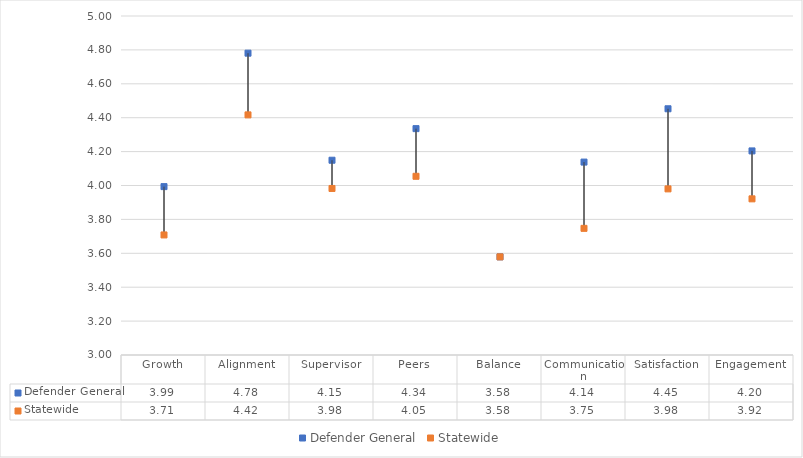
| Category | Defender General | Statewide |
|---|---|---|
| Growth | 3.993 | 3.708 |
| Alignment | 4.781 | 4.417 |
| Supervisor | 4.149 | 3.983 |
| Peers | 4.336 | 4.054 |
| Balance | 3.579 | 3.579 |
| Communication | 4.138 | 3.747 |
| Satisfaction | 4.453 | 3.98 |
| Engagement | 4.204 | 3.921 |